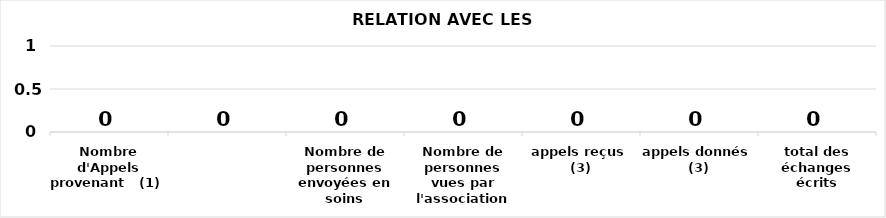
| Category | Series 0 |
|---|---|
| Nombre d'Appels provenant   (1)  | 0 |
| Nombre de personnes envoyées en soins | 0 |
| Nombre de personnes vues par l'association | 0 |
| appels reçus  (3) | 0 |
| appels donnés  (3) | 0 |
| total des échanges écrits | 0 |
| Total des visites | 0 |